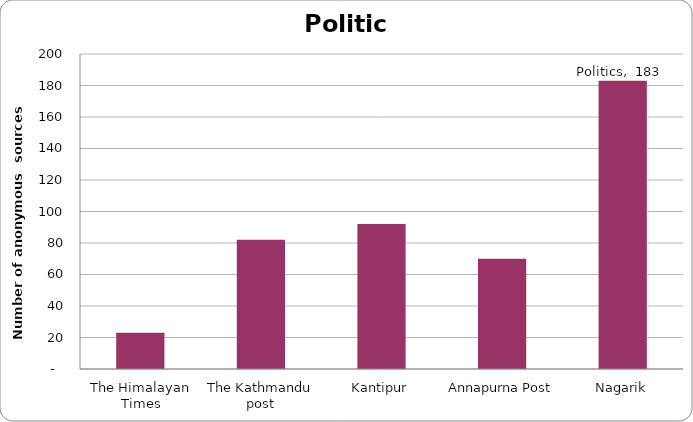
| Category | Politics |
|---|---|
| The Himalayan Times | 23 |
| The Kathmandu post | 82 |
| Kantipur | 92 |
| Annapurna Post | 70 |
| Nagarik | 183 |